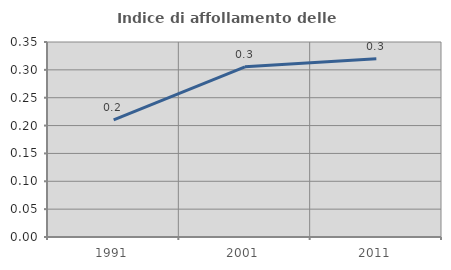
| Category | Indice di affollamento delle abitazioni  |
|---|---|
| 1991.0 | 0.21 |
| 2001.0 | 0.305 |
| 2011.0 | 0.32 |